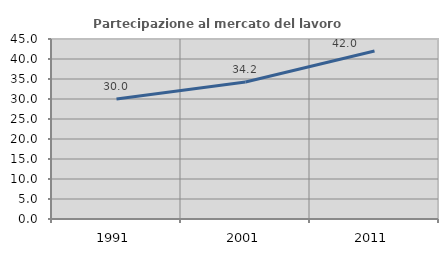
| Category | Partecipazione al mercato del lavoro  femminile |
|---|---|
| 1991.0 | 30.028 |
| 2001.0 | 34.248 |
| 2011.0 | 42.002 |